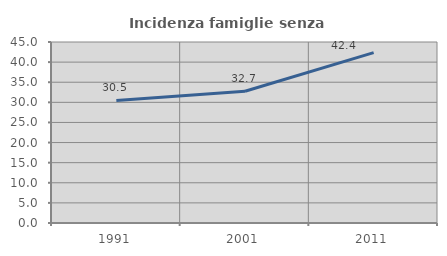
| Category | Incidenza famiglie senza nuclei |
|---|---|
| 1991.0 | 30.46 |
| 2001.0 | 32.749 |
| 2011.0 | 42.37 |